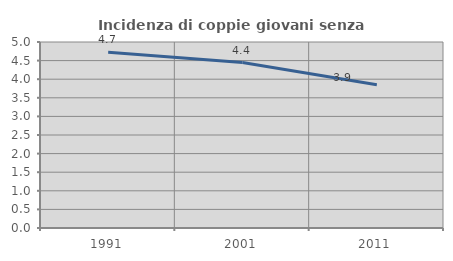
| Category | Incidenza di coppie giovani senza figli |
|---|---|
| 1991.0 | 4.722 |
| 2001.0 | 4.447 |
| 2011.0 | 3.851 |